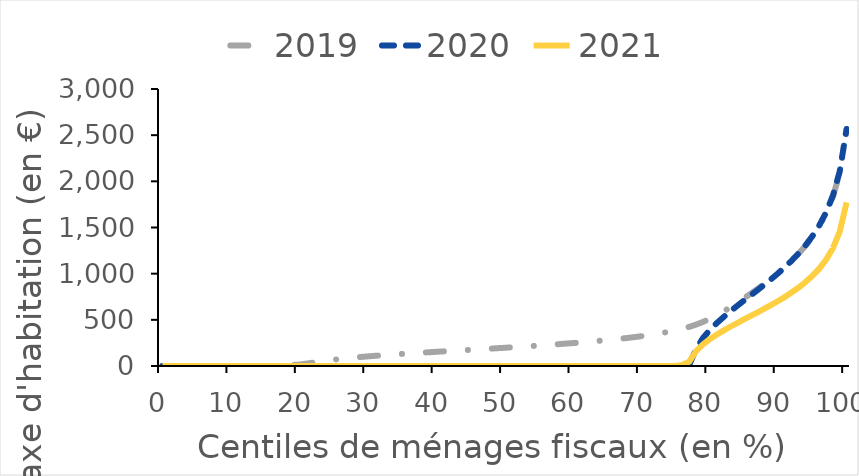
| Category | 2019 | 2020 | 2021 |
|---|---|---|---|
| 0.0 | 0 | 0 | 0 |
| 1.0 | 0 | 0 | 0 |
| 2.0 | 0 | 0 | 0 |
| 3.0 | 0 | 0 | 0 |
| 4.0 | 0 | 0 | 0 |
| 5.0 | 0 | 0 | 0 |
| 6.0 | 0 | 0 | 0 |
| 7.0 | 0 | 0 | 0 |
| 8.0 | 0 | 0 | 0 |
| 9.0 | 0 | 0 | 0 |
| 10.0 | 0 | 0 | 0 |
| 11.0 | 0 | 0 | 0 |
| 12.0 | 0 | 0 | 0 |
| 13.0 | 0 | 0 | 0 |
| 14.0 | 0 | 0 | 0 |
| 15.0 | 0 | 0 | 0 |
| 16.0 | 0 | 0 | 0 |
| 17.0 | 0 | 0 | 0 |
| 18.0 | 0 | 0 | 0 |
| 19.0 | 12 | 0 | 0 |
| 20.0 | 15 | 0 | 0 |
| 21.0 | 25 | 0 | 0 |
| 22.0 | 36 | 0 | 0 |
| 23.0 | 48 | 0 | 0 |
| 24.0 | 58 | 0 | 0 |
| 25.0 | 68 | 0 | 0 |
| 26.0 | 77 | 0 | 0 |
| 27.0 | 84 | 0 | 0 |
| 28.0 | 91 | 0 | 0 |
| 29.0 | 98 | 0 | 0 |
| 30.0 | 104 | 0 | 0 |
| 31.0 | 110 | 0 | 0 |
| 32.0 | 115 | 0 | 0 |
| 33.0 | 121 | 0 | 0 |
| 34.0 | 126 | 0 | 0 |
| 35.0 | 131 | 0 | 0 |
| 36.0 | 135 | 0 | 0 |
| 37.0 | 140 | 0 | 0 |
| 38.0 | 145 | 0 | 0 |
| 39.0 | 149 | 0 | 0 |
| 40.0 | 154 | 0 | 0 |
| 41.0 | 158 | 0 | 0 |
| 42.0 | 162 | 0 | 0 |
| 43.0 | 167 | 0 | 0 |
| 44.0 | 171 | 0 | 0 |
| 45.0 | 175 | 0 | 0 |
| 46.0 | 180 | 0 | 0 |
| 47.0 | 184 | 0 | 0 |
| 48.0 | 188 | 0 | 0 |
| 49.0 | 193 | 0 | 0 |
| 50.0 | 197 | 0 | 0 |
| 51.0 | 202 | 0 | 0 |
| 52.0 | 207 | 0 | 0 |
| 53.0 | 212 | 0 | 0 |
| 54.0 | 216 | 0 | 0 |
| 55.0 | 221 | 0 | 0 |
| 56.0 | 226 | 0 | 0 |
| 57.0 | 232 | 0 | 0 |
| 58.0 | 237 | 0 | 0 |
| 59.0 | 243 | 0 | 0 |
| 60.0 | 248 | 0 | 0 |
| 61.0 | 254 | 0 | 0 |
| 62.0 | 261 | 0 | 0 |
| 63.0 | 267 | 0 | 0 |
| 64.0 | 274 | 0 | 0 |
| 65.0 | 281 | 0 | 0 |
| 66.0 | 288 | 0 | 0 |
| 67.0 | 296 | 0 | 0 |
| 68.0 | 304 | 0 | 0 |
| 69.0 | 313 | 0 | 0 |
| 70.0 | 323 | 0 | 0 |
| 71.0 | 333 | 0 | 0 |
| 72.0 | 345 | 0 | 0 |
| 73.0 | 357 | 0 | 0 |
| 74.0 | 371 | 0 | 0 |
| 75.0 | 386 | 0 | 0 |
| 76.0 | 404 | 0 | 12 |
| 77.0 | 424 | 12 | 46 |
| 78.0 | 448 | 182 | 160 |
| 79.0 | 477 | 302 | 234 |
| 80.0 | 510 | 390 | 291 |
| 81.0 | 548 | 463 | 339 |
| 82.0 | 590 | 529 | 383 |
| 83.0 | 635 | 591 | 425 |
| 84.0 | 684 | 651 | 465 |
| 85.0 | 733 | 709 | 504 |
| 86.0 | 784 | 766 | 542 |
| 87.0 | 836 | 823 | 581 |
| 88.0 | 891 | 882 | 621 |
| 89.0 | 948 | 942 | 662 |
| 90.0 | 1008 | 1005 | 704 |
| 91.0 | 1072 | 1071 | 749 |
| 92.0 | 1142 | 1143 | 798 |
| 93.0 | 1218 | 1221 | 850 |
| 94.0 | 1302 | 1307 | 909 |
| 95.0 | 1399 | 1406 | 976 |
| 96.0 | 1513 | 1521 | 1054 |
| 97.0 | 1652 | 1662 | 1151 |
| 98.0 | 1832 | 1845 | 1276 |
| 99.0 | 2090 | 2107 | 1455 |
| 100.0 | 2545 | 2567 | 1772 |